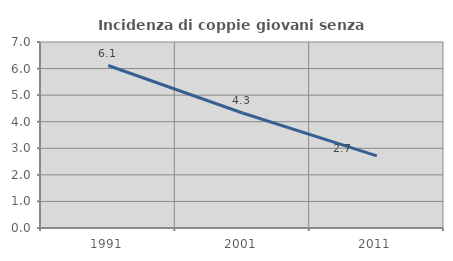
| Category | Incidenza di coppie giovani senza figli |
|---|---|
| 1991.0 | 6.115 |
| 2001.0 | 4.327 |
| 2011.0 | 2.713 |